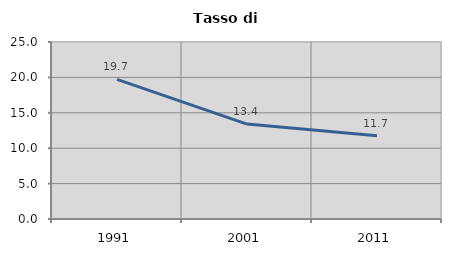
| Category | Tasso di disoccupazione   |
|---|---|
| 1991.0 | 19.722 |
| 2001.0 | 13.411 |
| 2011.0 | 11.744 |